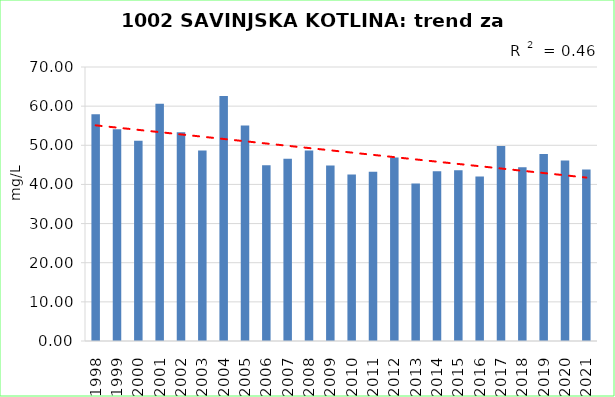
| Category | Vsota |
|---|---|
| 1998 | 57.933 |
| 1999 | 54.075 |
| 2000 | 51.133 |
| 2001 | 60.633 |
| 2002 | 53.358 |
| 2003 | 48.637 |
| 2004 | 62.583 |
| 2005 | 55.057 |
| 2006 | 44.885 |
| 2007 | 46.591 |
| 2008 | 48.65 |
| 2009 | 44.832 |
| 2010 | 42.518 |
| 2011 | 43.227 |
| 2012 | 46.909 |
| 2013 | 40.241 |
| 2014 | 43.345 |
| 2015 | 43.643 |
| 2016 | 42.023 |
| 2017 | 49.846 |
| 2018 | 44.412 |
| 2019 | 47.75 |
| 2020 | 46.085 |
| 2021 | 43.808 |